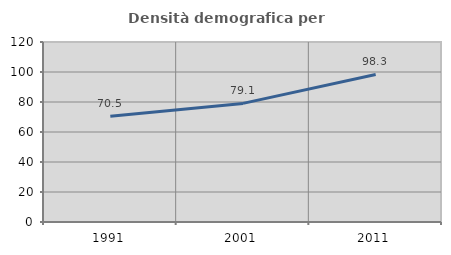
| Category | Densità demografica |
|---|---|
| 1991.0 | 70.469 |
| 2001.0 | 79.071 |
| 2011.0 | 98.334 |